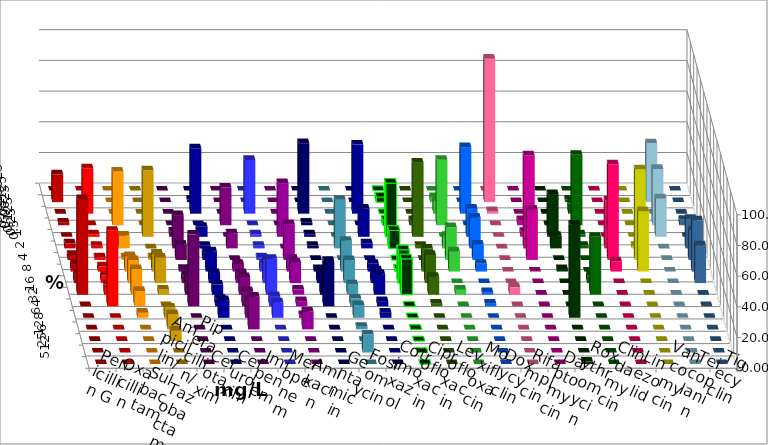
| Category | Penicillin G | Oxacillin | Ampicillin/ Sulbactam | Piperacillin/ Tazobactam | Cefotaxim | Cefuroxim | Imipenem | Meropenem | Amikacin | Gentamicin | Fosfomycin | Cotrimoxazol | Ciprofloxacin | Levofloxacin | Moxifloxacin | Doxycyclin | Rifampicin | Daptomycin | Roxythromycin | Clindamycin | Linezolid | Vancomycin | Teicoplanin | Tigecyclin |
|---|---|---|---|---|---|---|---|---|---|---|---|---|---|---|---|---|---|---|---|---|---|---|---|---|
| 0.015625 | 0 | 0 | 0 | 0 | 0 | 0 | 0 | 0 | 0 | 0 | 0 | 0 | 0 | 0 | 0 | 0 | 0 | 0 | 0 | 0 | 0 | 0 | 0 | 0 |
| 0.03125 | 18.033 | 1.639 | 0 | 0 | 0 | 0 | 1.639 | 0 | 0 | 0 | 0 | 0 | 3.333 | 0 | 3.279 | 0 | 93.443 | 0 | 0 | 1.639 | 0 | 0 | 0 | 38.333 |
| 0.0625 | 0 | 29.508 | 0 | 0 | 0 | 0 | 42.623 | 35 | 0 | 45.902 | 0 | 45 | 0 | 0 | 8.197 | 43.333 | 1.639 | 0 | 0 | 6.557 | 0 | 0 | 0 | 0 |
| 0.125 | 1.639 | 0 | 35 | 0 | 0 | 24.59 | 0 | 0 | 0 | 1.639 | 0 | 0 | 3.333 | 3.333 | 42.623 | 0 | 0 | 3.279 | 0 | 45.902 | 0 | 0 | 3.509 | 36.667 |
| 0.25 | 0 | 1.639 | 0 | 43.333 | 3.333 | 0 | 6.557 | 1.667 | 35 | 1.639 | 0 | 18.333 | 35 | 48.333 | 0 | 18.333 | 0 | 3.279 | 27.869 | 1.639 | 0 | 0 | 0 | 25 |
| 0.5 | 3.279 | 1.639 | 8.333 | 0 | 21.667 | 9.836 | 1.639 | 1.667 | 0 | 1.639 | 31.667 | 3.333 | 11.667 | 1.667 | 8.197 | 20 | 0 | 60.656 | 8.197 | 1.639 | 31.148 | 1.639 | 19.298 | 0 |
| 1.0 | 3.279 | 1.639 | 1.667 | 1.667 | 10 | 0 | 4.918 | 1.667 | 23.333 | 0 | 0 | 0 | 0 | 0 | 21.311 | 10 | 0 | 32.787 | 0 | 0 | 62.295 | 59.016 | 19.298 | 0 |
| 2.0 | 4.918 | 3.279 | 10 | 11.667 | 1.667 | 4.918 | 13.115 | 5 | 8.333 | 1.639 | 20 | 5 | 1.667 | 15 | 13.115 | 5 | 0 | 0 | 1.639 | 0 | 6.557 | 39.344 | 33.333 | 0 |
| 4.0 | 6.557 | 4.918 | 15 | 16.667 | 5 | 6.557 | 6.557 | 15 | 13.333 | 8.197 | 15 | 8.333 | 21.667 | 18.333 | 0 | 0 | 0 | 0 | 0 | 4.918 | 0 | 0 | 24.561 | 0 |
| 8.0 | 62.295 | 6.557 | 16.667 | 3.333 | 11.667 | 11.475 | 6.557 | 23.333 | 3.333 | 9.836 | 6.667 | 13.333 | 23.333 | 11.667 | 3.279 | 1.667 | 4.918 | 0 | 0 | 37.705 | 0 | 0 | 0 | 0 |
| 16.0 | 0 | 49.18 | 10 | 0 | 46.667 | 9.836 | 4.918 | 6.667 | 3.333 | 29.508 | 5 | 3.333 | 0 | 1.667 | 0 | 1.667 | 0 | 0 | 0 | 0 | 0 | 0 | 0 | 0 |
| 32.0 | 0 | 0 | 3.333 | 6.667 | 0 | 11.475 | 11.475 | 10 | 1.667 | 0 | 8.333 | 3.333 | 0 | 0 | 0 | 0 | 0 | 0 | 60.656 | 0 | 0 | 0 | 0 | 0 |
| 64.0 | 0 | 0 | 0 | 10 | 0 | 21.311 | 0 | 0 | 11.667 | 0 | 1.667 | 0 | 0 | 0 | 0 | 0 | 0 | 0 | 0 | 0 | 0 | 0 | 0 | 0 |
| 128.0 | 0 | 0 | 0 | 6.667 | 0 | 0 | 0 | 0 | 0 | 0 | 0 | 0 | 0 | 0 | 0 | 0 | 0 | 0 | 0 | 0 | 0 | 0 | 0 | 0 |
| 256.0 | 0 | 0 | 0 | 0 | 0 | 0 | 0 | 0 | 0 | 0 | 11.667 | 0 | 0 | 0 | 0 | 0 | 0 | 0 | 0 | 0 | 0 | 0 | 0 | 0 |
| 512.0 | 0 | 0 | 0 | 0 | 0 | 0 | 0 | 0 | 0 | 0 | 0 | 0 | 0 | 0 | 0 | 0 | 0 | 0 | 1.639 | 0 | 0 | 0 | 0 | 0 |